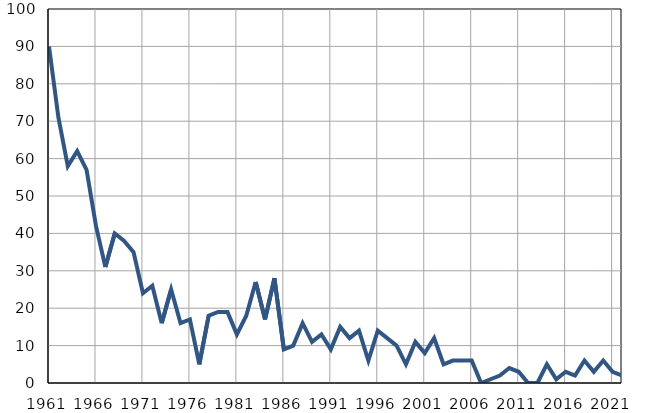
| Category | Умрла 
одојчад |
|---|---|
| 1961.0 | 90 |
| 1962.0 | 71 |
| 1963.0 | 58 |
| 1964.0 | 62 |
| 1965.0 | 57 |
| 1966.0 | 42 |
| 1967.0 | 31 |
| 1968.0 | 40 |
| 1969.0 | 38 |
| 1970.0 | 35 |
| 1971.0 | 24 |
| 1972.0 | 26 |
| 1973.0 | 16 |
| 1974.0 | 25 |
| 1975.0 | 16 |
| 1976.0 | 17 |
| 1977.0 | 5 |
| 1978.0 | 18 |
| 1979.0 | 19 |
| 1980.0 | 19 |
| 1981.0 | 13 |
| 1982.0 | 18 |
| 1983.0 | 27 |
| 1984.0 | 17 |
| 1985.0 | 28 |
| 1986.0 | 9 |
| 1987.0 | 10 |
| 1988.0 | 16 |
| 1989.0 | 11 |
| 1990.0 | 13 |
| 1991.0 | 9 |
| 1992.0 | 15 |
| 1993.0 | 12 |
| 1994.0 | 14 |
| 1995.0 | 6 |
| 1996.0 | 14 |
| 1997.0 | 12 |
| 1998.0 | 10 |
| 1999.0 | 5 |
| 2000.0 | 11 |
| 2001.0 | 8 |
| 2002.0 | 12 |
| 2003.0 | 5 |
| 2004.0 | 6 |
| 2005.0 | 6 |
| 2006.0 | 6 |
| 2007.0 | 0 |
| 2008.0 | 1 |
| 2009.0 | 2 |
| 2010.0 | 4 |
| 2011.0 | 3 |
| 2012.0 | 0 |
| 2013.0 | 0 |
| 2014.0 | 5 |
| 2015.0 | 1 |
| 2016.0 | 3 |
| 2017.0 | 2 |
| 2018.0 | 6 |
| 2019.0 | 3 |
| 2020.0 | 6 |
| 2021.0 | 3 |
| 2022.0 | 2 |